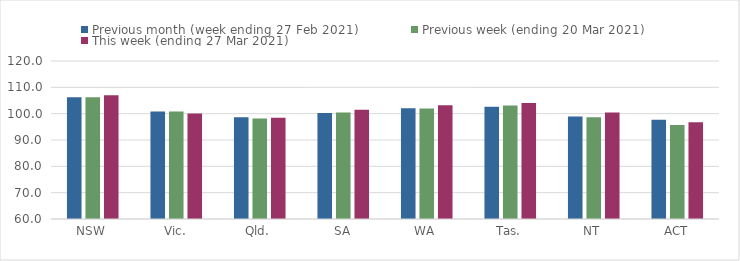
| Category | Previous month (week ending 27 Feb 2021) | Previous week (ending 20 Mar 2021) | This week (ending 27 Mar 2021) |
|---|---|---|---|
| NSW | 106.25 | 106.23 | 107.04 |
| Vic. | 100.81 | 100.87 | 100.02 |
| Qld. | 98.65 | 98.15 | 98.43 |
| SA | 100.26 | 100.47 | 101.51 |
| WA | 102.03 | 101.94 | 103.15 |
| Tas. | 102.66 | 103.1 | 104.06 |
| NT | 98.9 | 98.6 | 100.49 |
| ACT | 97.71 | 95.74 | 96.7 |